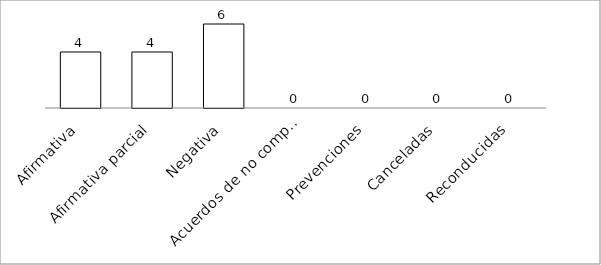
| Category | Series 0 |
|---|---|
| Afirmativa | 4 |
| Afirmativa parcial | 4 |
| Negativa | 6 |
| Acuerdos de no competencia | 0 |
| Prevenciones | 0 |
| Canceladas | 0 |
| Reconducidas | 0 |